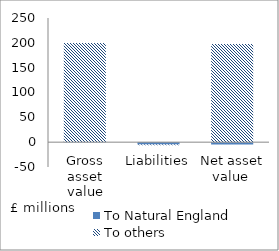
| Category | To Natural England | To others |
|---|---|---|
| Gross asset value | 0.253 | 199.296 |
| Liabilities | -4.896 | -1.442 |
| Net asset value  | -4.643 | 197.854 |